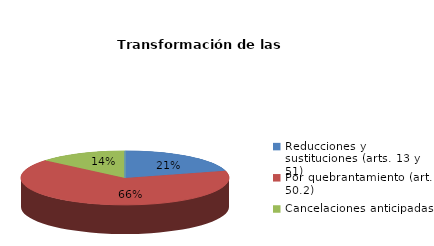
| Category | Series 0 |
|---|---|
| Reducciones y sustituciones (arts. 13 y 51) | 6 |
| Por quebrantamiento (art. 50.2) | 19 |
| Cancelaciones anticipadas | 4 |
| Traslado a Centros Penitenciarios | 0 |
| Conversión internamientos en cerrados (art. 51.2) | 0 |